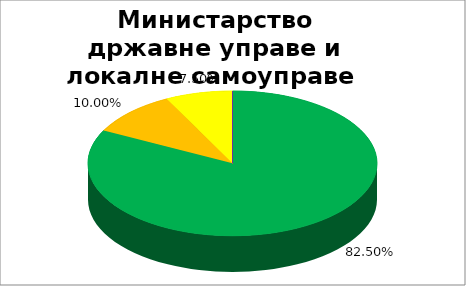
| Category | Министарство државне управе и локалне самоуправе  |
|---|---|
| 0 | 0.825 |
| 1 | 0.1 |
| 2 | 0.075 |
| 3 | 0 |
| 4 | 0 |